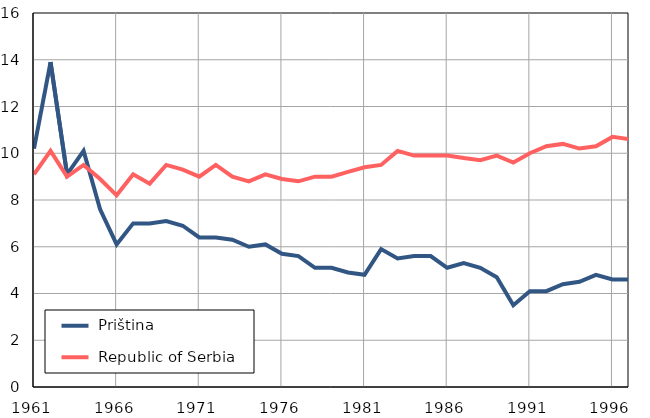
| Category |  Priština |  Republic of Serbia |
|---|---|---|
| 1961.0 | 10.2 | 9.1 |
| 1962.0 | 13.9 | 10.1 |
| 1963.0 | 9.1 | 9 |
| 1964.0 | 10.1 | 9.5 |
| 1965.0 | 7.6 | 8.9 |
| 1966.0 | 6.1 | 8.2 |
| 1967.0 | 7 | 9.1 |
| 1968.0 | 7 | 8.7 |
| 1969.0 | 7.1 | 9.5 |
| 1970.0 | 6.9 | 9.3 |
| 1971.0 | 6.4 | 9 |
| 1972.0 | 6.4 | 9.5 |
| 1973.0 | 6.3 | 9 |
| 1974.0 | 6 | 8.8 |
| 1975.0 | 6.1 | 9.1 |
| 1976.0 | 5.7 | 8.9 |
| 1977.0 | 5.6 | 8.8 |
| 1978.0 | 5.1 | 9 |
| 1979.0 | 5.1 | 9 |
| 1980.0 | 4.9 | 9.2 |
| 1981.0 | 4.8 | 9.4 |
| 1982.0 | 5.9 | 9.5 |
| 1983.0 | 5.5 | 10.1 |
| 1984.0 | 5.6 | 9.9 |
| 1985.0 | 5.6 | 9.9 |
| 1986.0 | 5.1 | 9.9 |
| 1987.0 | 5.3 | 9.8 |
| 1988.0 | 5.1 | 9.7 |
| 1989.0 | 4.7 | 9.9 |
| 1990.0 | 3.5 | 9.6 |
| 1991.0 | 4.1 | 10 |
| 1992.0 | 4.1 | 10.3 |
| 1993.0 | 4.4 | 10.4 |
| 1994.0 | 4.5 | 10.2 |
| 1995.0 | 4.8 | 10.3 |
| 1996.0 | 4.6 | 10.7 |
| 1997.0 | 4.6 | 10.6 |